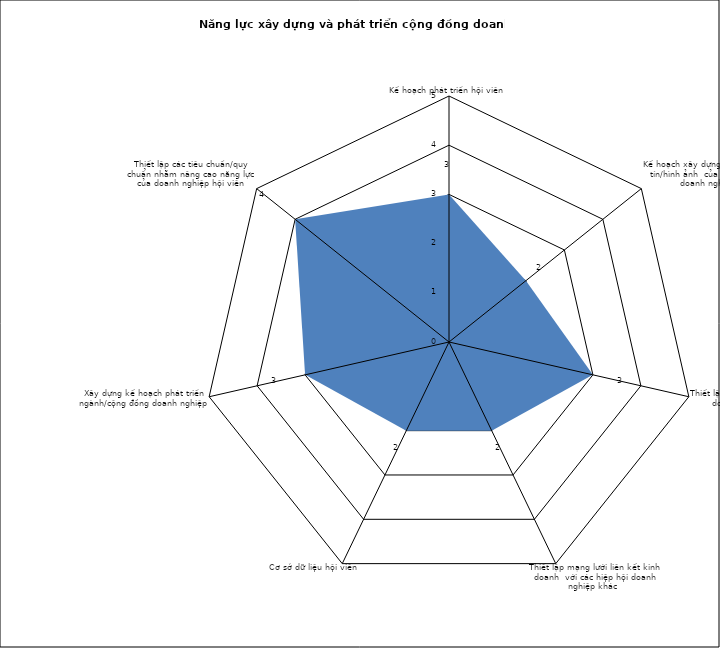
| Category | Series 0 |
|---|---|
| Kế hoạch phát triển hội viên  | 3 |
| Kế hoạch xây dựng và bảo vệ uy tín/hình ảnh  của hiệp hội/hội doanh nghiệp  | 2 |
| Thiết lập mạng lưới liên kết kinh doanh trong hiệp hội  | 3 |
| Thiết lập mạng lưới liên kết kinh doanh  với các hiệp hội doanh nghiệp khác  | 2 |
| Cơ sở dữ liệu hội viên  | 2 |
| Xây dựng kế hoạch phát triển ngành/cộng đồng doanh nghiệp | 3 |
| Thiết lập các tiêu chuẩn/quy chuẩn nhằm nâng cao năng lực của doanh nghiệp hội viên | 4 |